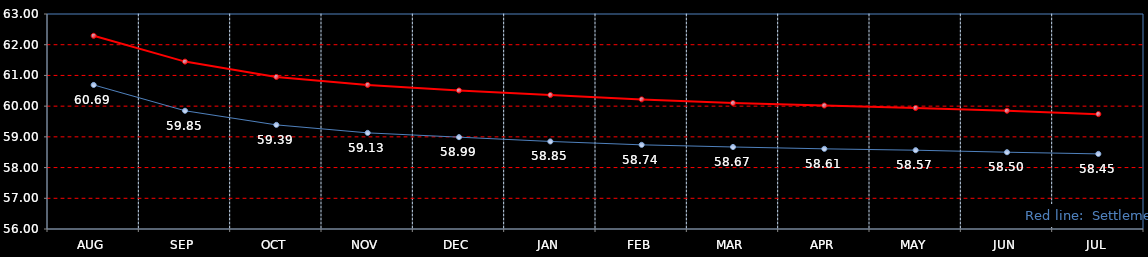
| Category | Last | Settlement |
|---|---|---|
| AUG | 60.69 | 62.29 |
| SEP | 59.85 | 61.45 |
| OCT | 59.39 | 60.95 |
| NOV | 59.13 | 60.69 |
| DEC | 58.99 | 60.51 |
| JAN | 58.85 | 60.36 |
| FEB | 58.74 | 60.22 |
| MAR | 58.67 | 60.1 |
| APR | 58.61 | 60.02 |
| MAY | 58.565 | 59.94 |
| JUN | 58.5 | 59.85 |
| JUL | 58.445 | 59.74 |